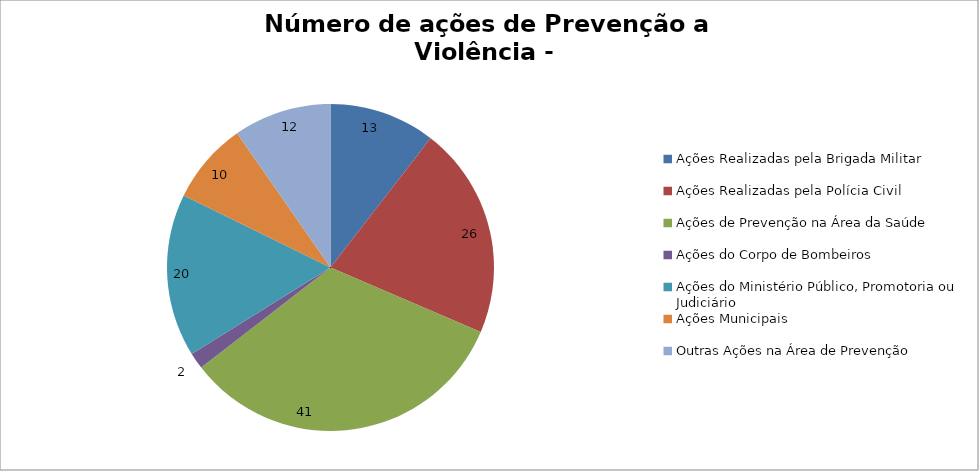
| Category | Número de Ações |
|---|---|
| Ações Realizadas pela Brigada Militar | 13 |
| Ações Realizadas pela Polícia Civil | 26 |
| Ações de Prevenção na Área da Saúde | 41 |
| Ações do Corpo de Bombeiros | 2 |
| Ações do Ministério Público, Promotoria ou Judiciário | 20 |
| Ações Municipais | 10 |
| Outras Ações na Área de Prevenção | 12 |